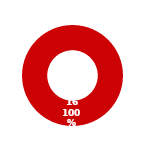
| Category | ASSET |
|---|---|
| MIL 2 Complete | 0 |
| MIL 2 Not Complete | 16 |